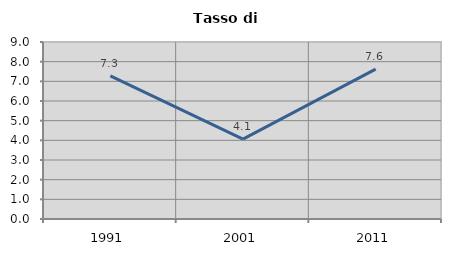
| Category | Tasso di disoccupazione   |
|---|---|
| 1991.0 | 7.277 |
| 2001.0 | 4.065 |
| 2011.0 | 7.624 |